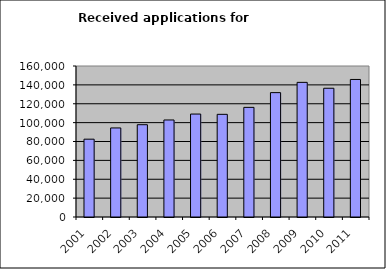
| Category | Series 0 |
|---|---|
| 2001.0 | 82454 |
| 2002.0 | 94358 |
| 2003.0 | 97793 |
| 2004.0 | 102813 |
| 2005.0 | 109089 |
| 2006.0 | 108785 |
| 2007.0 | 116159 |
| 2008.0 | 131779 |
| 2009.0 | 142663 |
| 2010.0 | 136417 |
| 2011.0 | 145733 |